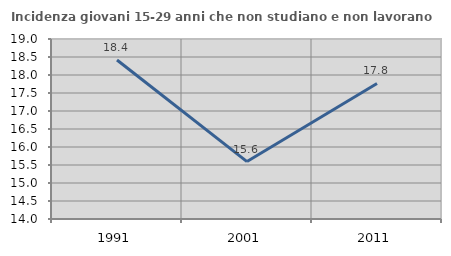
| Category | Incidenza giovani 15-29 anni che non studiano e non lavorano  |
|---|---|
| 1991.0 | 18.415 |
| 2001.0 | 15.595 |
| 2011.0 | 17.765 |